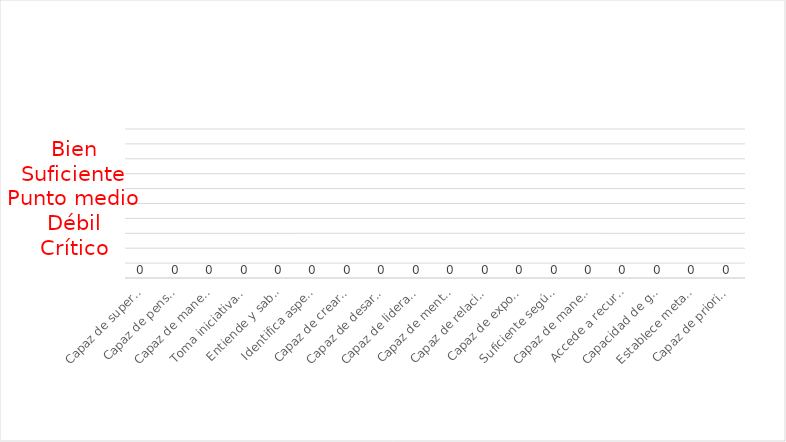
| Category | Bien;Suficiente;Punto muerto;Débil;Crítico |
|---|---|
| Capaz de superar situaciones adversas | 0 |
| Capaz de pensar de forma imaginativa | 0 |
| Capaz de manejar incertidumbre y riesgo | 0 |
| Toma iniciativas y busca soluciones | 0 |
| Entiende y sabe explicar su rol | 0 |
| Identifica aspectos que le dan valor | 0 |
| Capaz de crear una red de apoyos | 0 |
| Capaz de desarrollar networking | 0 |
| Capaz de liderar un equipo | 0 |
| Capaz de mentorizar al equipo | 0 |
| Capaz de relacionarse en cualquier medio | 0 |
| Capaz de exponer en público su proyecto | 0 |
| Suficiente según parámetros del proyecto | 0 |
| Capaz de manejar estados financieros | 0 |
| Accede a recursos materiales básicos | 0 |
| Capacidad de gestión en entornos o ambientes | 0 |
| Establece metas y objetivos | 0 |
| Capaz de priorizar y gestionar oportunidades | 0 |